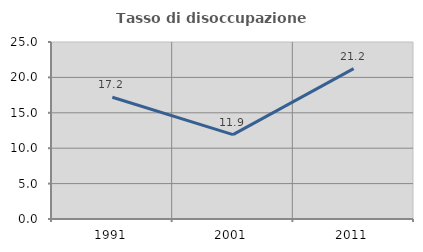
| Category | Tasso di disoccupazione giovanile  |
|---|---|
| 1991.0 | 17.195 |
| 2001.0 | 11.924 |
| 2011.0 | 21.245 |